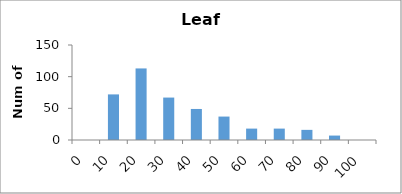
| Category | Series 0 |
|---|---|
| 0.0 | 0 |
| 10.0 | 72 |
| 20.0 | 113 |
| 30.0 | 67 |
| 40.0 | 49 |
| 50.0 | 37 |
| 60.0 | 18 |
| 70.0 | 18 |
| 80.0 | 16 |
| 90.0 | 7 |
| 100.0 | 0 |